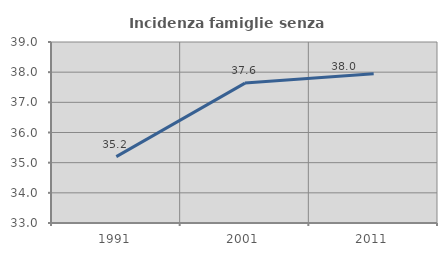
| Category | Incidenza famiglie senza nuclei |
|---|---|
| 1991.0 | 35.2 |
| 2001.0 | 37.637 |
| 2011.0 | 37.95 |